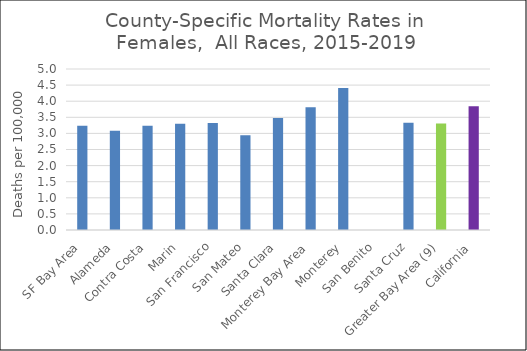
| Category | Female |
|---|---|
| SF Bay Area | 3.24 |
|   Alameda | 3.08 |
|   Contra Costa | 3.24 |
|   Marin | 3.3 |
|   San Francisco | 3.32 |
|   San Mateo | 2.94 |
|   Santa Clara | 3.48 |
| Monterey Bay Area | 3.81 |
|   Monterey | 4.41 |
|   San Benito | 0 |
|   Santa Cruz | 3.33 |
| Greater Bay Area (9) | 3.31 |
| California | 3.84 |